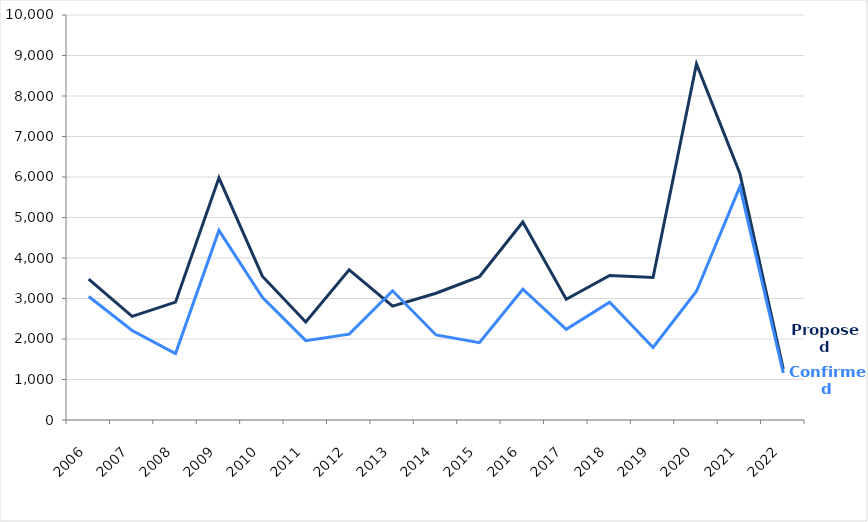
| Category | Proposed | Confirmed |
|---|---|---|
| 2006 | 3480 | 3050 |
| 2007 | 2560 | 2210 |
| 2008 | 2910 | 1640 |
| 2009 | 5980 | 4680 |
| 2010 | 3550 | 3030 |
| 2011 | 2420 | 1960 |
| 2012 | 3710 | 2120 |
| 2013 | 2810 | 3190 |
| 2014 | 3130 | 2100 |
| 2015 | 3540 | 1910 |
| 2016 | 4890 | 3230 |
| 2017 | 2980 | 2240 |
| 2018 | 3570 | 2910 |
| 2019 | 3520 | 1790 |
| 2020 | 8790 | 3180 |
| 2021 | 6090 | 5760 |
| 2022 | 1260 | 1160 |